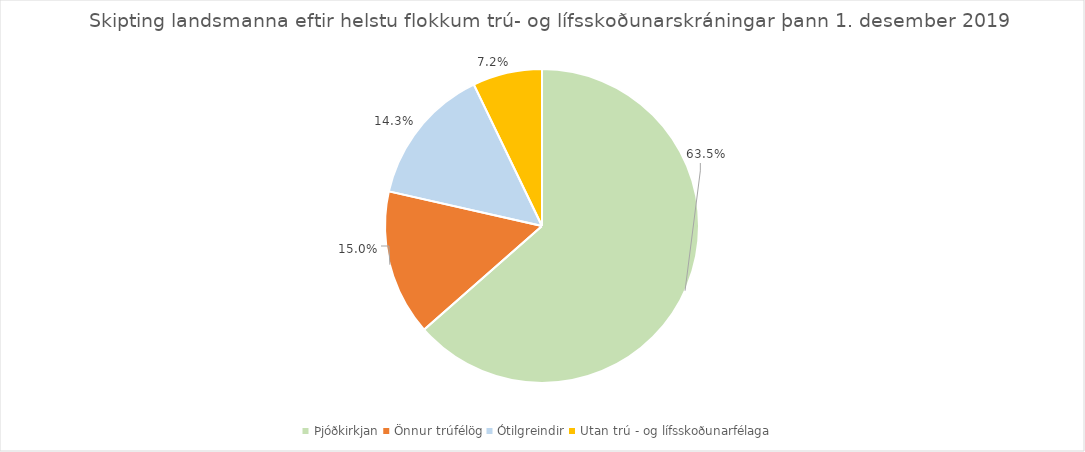
| Category | Series 0 |
|---|---|
| Þjóðkirkjan | 0.635 |
| Önnur trúfélög | 0.15 |
| Ótilgreindir | 0.143 |
| Utan trú - og lífsskoðunarfélaga | 0.072 |